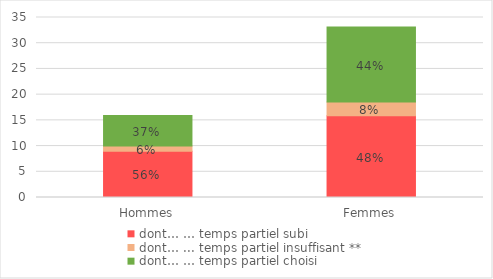
| Category | dont… |
|---|---|
| Hommes | 5.91 |
| Femmes | 14.589 |